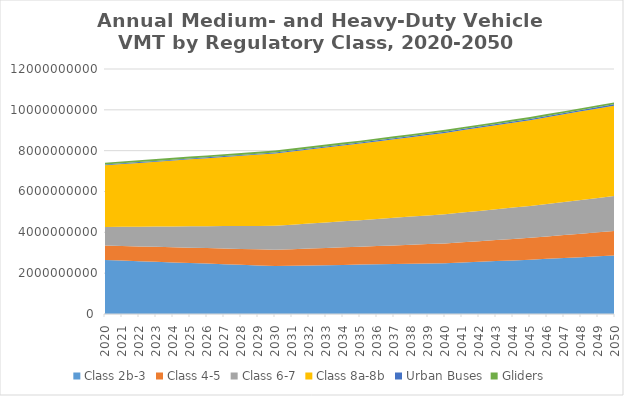
| Category | Class 2b-3 | Class 4-5 | Class 6-7 | Class 8a-8b | Urban Buses | Gliders |
|---|---|---|---|---|---|---|
| 2020.0 | 2645596528.308 | 705363957.385 | 912303196.308 | 3020838641.846 | 37285656.861 | 91714747.072 |
| 2021.0 | 2616064027.077 | 714439209.846 | 938648547.077 | 3072961470.462 | 38108630.825 | 92149980.284 |
| 2022.0 | 2586531525.846 | 723514462.308 | 964993897.846 | 3125084299.077 | 38931604.788 | 92585213.495 |
| 2023.0 | 2556999024.615 | 732589714.769 | 991339248.615 | 3177207127.692 | 39754578.752 | 93020446.707 |
| 2024.0 | 2527466523.385 | 741664967.231 | 1017684599.385 | 3229329956.308 | 40577552.716 | 93455679.918 |
| 2025.0 | 2497934022.154 | 750740219.692 | 1044029950.154 | 3281452784.923 | 41400526.68 | 93890913.13 |
| 2026.0 | 2468401520.923 | 759815472.154 | 1070375300.923 | 3333575613.538 | 42223500.644 | 94326146.341 |
| 2027.0 | 2438869019.692 | 768890724.615 | 1096720651.692 | 3385698442.154 | 43046474.608 | 94761379.553 |
| 2028.0 | 2409336518.462 | 777965977.077 | 1123066002.462 | 3437821270.769 | 43869448.572 | 95196612.764 |
| 2029.0 | 2379804017.231 | 787041229.538 | 1149411353.231 | 3489944099.385 | 44692422.536 | 95631845.976 |
| 2030.0 | 2350271516 | 796116482 | 1175756704 | 3542066928 | 45515396.5 | 96067079.188 |
| 2031.0 | 2363990217.357 | 812265330.9 | 1200105810.357 | 3584147677.927 | 46810306.963 | 95661659.887 |
| 2032.0 | 2377708918.713 | 828414179.799 | 1224454916.715 | 3626228427.854 | 48105217.427 | 95256240.586 |
| 2033.0 | 2391427620.07 | 844563028.699 | 1248804023.072 | 3668309177.781 | 49400127.89 | 94850821.286 |
| 2034.0 | 2405146321.426 | 860711877.598 | 1273153129.429 | 3710389927.708 | 50695038.353 | 94445401.985 |
| 2035.0 | 2418865022.783 | 876860726.498 | 1297502235.787 | 3752470677.635 | 51989948.817 | 94039982.685 |
| 2036.0 | 2432873540.226 | 895229532.198 | 1324234637.829 | 3798487029.708 | 53413281.653 | 93561425.223 |
| 2037.0 | 2446882057.67 | 913598337.899 | 1350967039.872 | 3844503381.781 | 54836614.49 | 93082867.761 |
| 2038.0 | 2460890575.113 | 931967143.599 | 1377699441.915 | 3890519733.854 | 56259947.327 | 92604310.299 |
| 2039.0 | 2474899092.557 | 950335949.3 | 1404431843.957 | 3936536085.927 | 57683280.163 | 92125752.837 |
| 2040.0 | 2488907610 | 968704755 | 1431164246 | 3982552438 | 59106613 | 91647195.375 |
| 2041.0 | 2523157343.412 | 989556972.063 | 1457152786.252 | 4025687052.563 | 60200749.925 | 90936357.896 |
| 2042.0 | 2557407076.824 | 1010409189.126 | 1483141326.504 | 4068821667.126 | 61294886.85 | 90225520.417 |
| 2043.0 | 2591656810.236 | 1031261406.189 | 1509129866.756 | 4111956281.689 | 62389023.775 | 89514682.938 |
| 2044.0 | 2625906543.648 | 1052113623.253 | 1535118407.008 | 4155090896.252 | 63483160.701 | 88803845.459 |
| 2045.0 | 2660156277.06 | 1072965840.316 | 1561106947.261 | 4198225510.815 | 64577297.626 | 88093007.98 |
| 2046.0 | 2701497352.448 | 1097958370.053 | 1592230730.608 | 4244922375.052 | 65737326.063 | 87582229.209 |
| 2047.0 | 2742838427.836 | 1122950899.789 | 1623354513.956 | 4291619239.289 | 66897354.5 | 87071450.438 |
| 2048.0 | 2784179503.224 | 1147943429.526 | 1654478297.304 | 4338316103.526 | 68057382.938 | 86560671.667 |
| 2049.0 | 2825520578.612 | 1172935959.263 | 1685602080.652 | 4385012967.763 | 69217411.375 | 86049892.896 |
| 2050.0 | 2866861654 | 1197928489 | 1716725864 | 4431709832 | 70377439.812 | 85539114.125 |